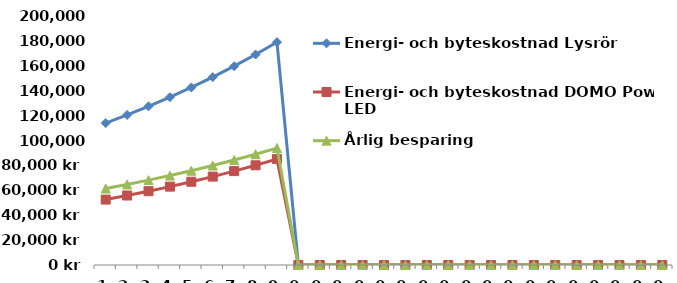
| Category | Energi- och byteskostnad Lysrör | Energi- och byteskostnad DOMO Power LED | Årlig besparing |
|---|---|---|---|
| 1.0 | 114008.889 | 52560 | 61448.889 |
| 2.0 | 120526.329 | 55818.72 | 64707.609 |
| 3.0 | 127447.85 | 59279.481 | 68168.37 |
| 4.0 | 134798.506 | 62954.808 | 71843.697 |
| 5.0 | 142604.902 | 66858.007 | 75746.895 |
| 6.0 | 150895.295 | 71003.203 | 79892.092 |
| 7.0 | 159699.692 | 75405.402 | 84294.29 |
| 8.0 | 169049.962 | 80080.536 | 88969.425 |
| 9.0 | 178979.948 | 85045.53 | 93934.419 |
| 0.0 | 0 | 0 | 0 |
| 0.0 | 0 | 0 | 0 |
| 0.0 | 0 | 0 | 0 |
| 0.0 | 0 | 0 | 0 |
| 0.0 | 0 | 0 | 0 |
| 0.0 | 0 | 0 | 0 |
| 0.0 | 0 | 0 | 0 |
| 0.0 | 0 | 0 | 0 |
| 0.0 | 0 | 0 | 0 |
| 0.0 | 0 | 0 | 0 |
| 0.0 | 0 | 0 | 0 |
| 0.0 | 0 | 0 | 0 |
| 0.0 | 0 | 0 | 0 |
| 0.0 | 0 | 0 | 0 |
| 0.0 | 0 | 0 | 0 |
| 0.0 | 0 | 0 | 0 |
| 0.0 | 0 | 0 | 0 |
| 0.0 | 0 | 0 | 0 |